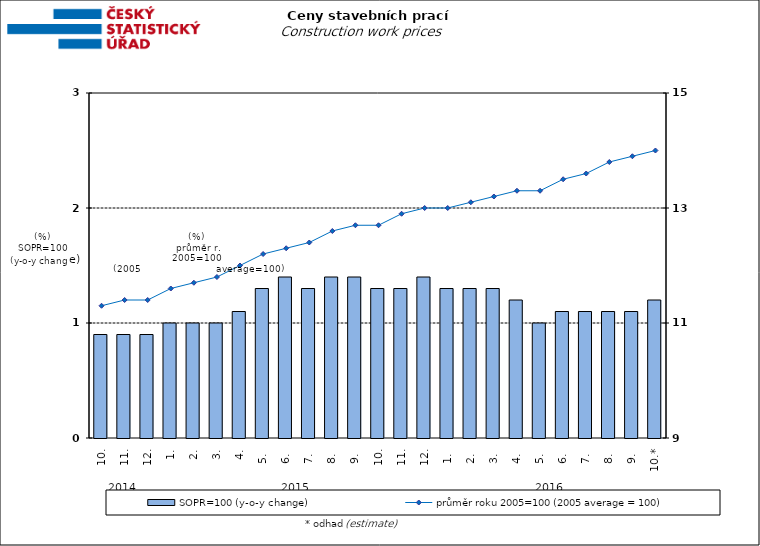
| Category | SOPR=100 (y-o-y change)   |
|---|---|
| 0 | 0.9 |
| 1 | 0.9 |
| 2 | 0.9 |
| 3 | 1 |
| 4 | 1 |
| 5 | 1 |
| 6 | 1.1 |
| 7 | 1.3 |
| 8 | 1.4 |
| 9 | 1.3 |
| 10 | 1.4 |
| 11 | 1.4 |
| 12 | 1.3 |
| 13 | 1.3 |
| 14 | 1.4 |
| 15 | 1.3 |
| 16 | 1.3 |
| 17 | 1.3 |
| 18 | 1.2 |
| 19 | 1 |
| 20 | 1.1 |
| 21 | 1.1 |
| 22 | 1.1 |
| 23 | 1.1 |
| 24 | 1.2 |